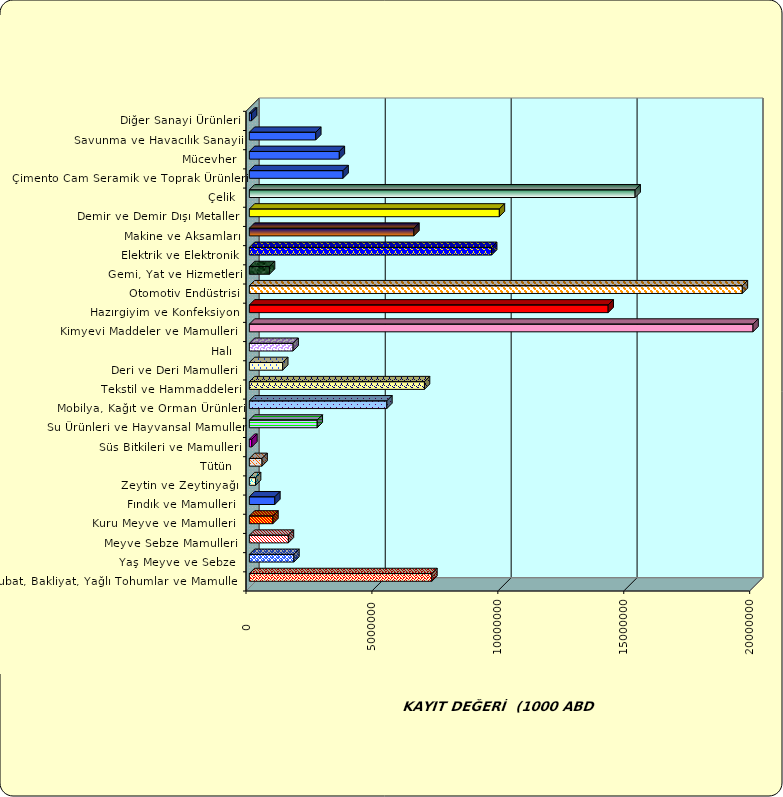
| Category | Series 0 |
|---|---|
|  Hububat, Bakliyat, Yağlı Tohumlar ve Mamulleri  | 7247608.952 |
|  Yaş Meyve ve Sebze   | 1767990.489 |
|  Meyve Sebze Mamulleri  | 1549689.716 |
|  Kuru Meyve ve Mamulleri   | 935862.367 |
|  Fındık ve Mamulleri  | 1011259.677 |
|  Zeytin ve Zeytinyağı  | 245860.998 |
|  Tütün  | 504364.231 |
|  Süs Bitkileri ve Mamulleri | 98362.628 |
|  Su Ürünleri ve Hayvansal Mamuller | 2695502.328 |
|  Mobilya, Kağıt ve Orman Ürünleri | 5460121.324 |
|  Tekstil ve Hammaddeleri | 6953620.744 |
|  Deri ve Deri Mamulleri  | 1324110.526 |
|  Halı  | 1736002.935 |
|  Kimyevi Maddeler ve Mamulleri   | 22630092.233 |
|  Hazırgiyim ve Konfeksiyon  | 14248017.66 |
|  Otomotiv Endüstrisi | 19576415.65 |
|  Gemi, Yat ve Hizmetleri | 799842.603 |
|  Elektrik ve Elektronik | 9620600.373 |
|  Makine ve Aksamları | 6533708.508 |
|  Demir ve Demir Dışı Metaller  | 9927851.182 |
|  Çelik | 15317664.841 |
|  Çimento Cam Seramik ve Toprak Ürünleri | 3720766.331 |
|  Mücevher | 3572481.907 |
|  Savunma ve Havacılık Sanayii | 2636816.323 |
|  Diğer Sanayi Ürünleri | 88537.107 |